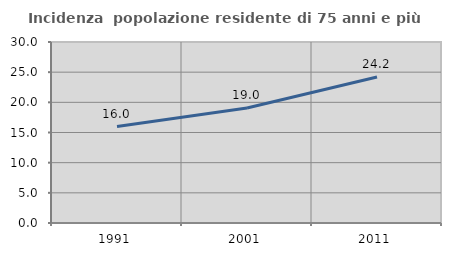
| Category | Incidenza  popolazione residente di 75 anni e più |
|---|---|
| 1991.0 | 15.987 |
| 2001.0 | 19.048 |
| 2011.0 | 24.204 |